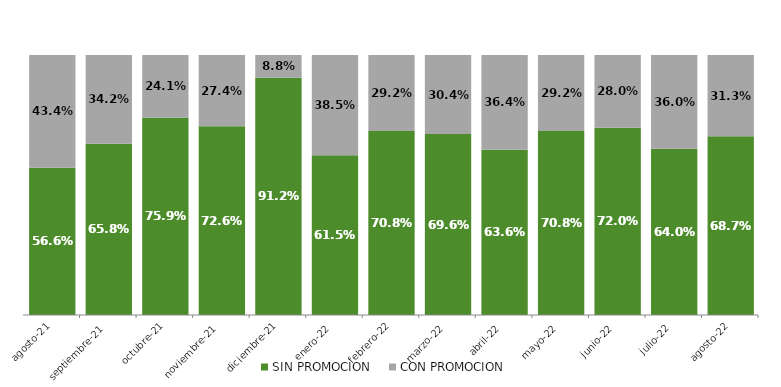
| Category | SIN PROMOCION   | CON PROMOCION   |
|---|---|---|
| 2021-08-01 | 0.566 | 0.434 |
| 2021-09-01 | 0.658 | 0.342 |
| 2021-10-01 | 0.759 | 0.241 |
| 2021-11-01 | 0.726 | 0.274 |
| 2021-12-01 | 0.912 | 0.088 |
| 2022-01-01 | 0.615 | 0.385 |
| 2022-02-01 | 0.708 | 0.292 |
| 2022-03-01 | 0.696 | 0.304 |
| 2022-04-01 | 0.636 | 0.364 |
| 2022-05-01 | 0.708 | 0.292 |
| 2022-06-01 | 0.72 | 0.28 |
| 2022-07-01 | 0.64 | 0.36 |
| 2022-08-01 | 0.687 | 0.313 |